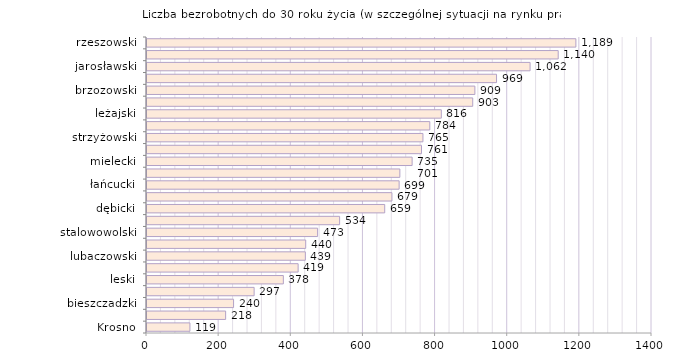
| Category | Liczba bezrobotnych do 30 roku życia - w szczególnej sytuacji na rynku pracy |
|---|---|
| Krosno | 119 |
| Tarnobrzeg | 218 |
| bieszczadzki | 240 |
| tarnobrzeski  | 297 |
| leski | 378 |
| Przemyśl | 419 |
| lubaczowski | 439 |
| kolbuszowski | 440 |
| stalowowolski | 473 |
| krośnieński | 534 |
| dębicki | 659 |
| sanocki | 679 |
| łańcucki | 699 |
| przemyski | 701 |
| mielecki | 735 |
| ropczycko-sędziszowski | 761 |
| strzyżowski | 765 |
| niżański | 784 |
| leżajski | 816 |
| przeworski | 903 |
| brzozowski | 909 |
| Rzeszów | 969 |
| jarosławski | 1062 |
| jasielski | 1140 |
| rzeszowski | 1189 |